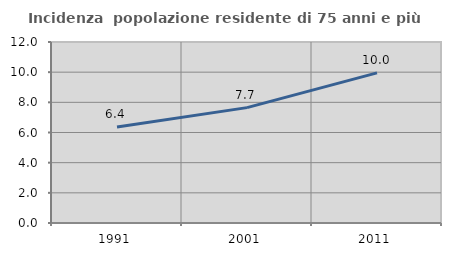
| Category | Incidenza  popolazione residente di 75 anni e più |
|---|---|
| 1991.0 | 6.363 |
| 2001.0 | 7.65 |
| 2011.0 | 9.951 |